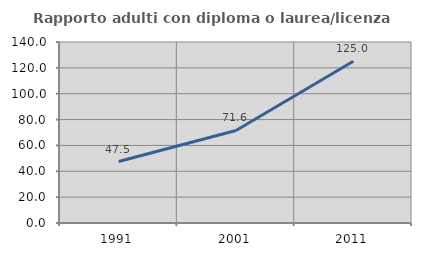
| Category | Rapporto adulti con diploma o laurea/licenza media  |
|---|---|
| 1991.0 | 47.535 |
| 2001.0 | 71.584 |
| 2011.0 | 125.047 |